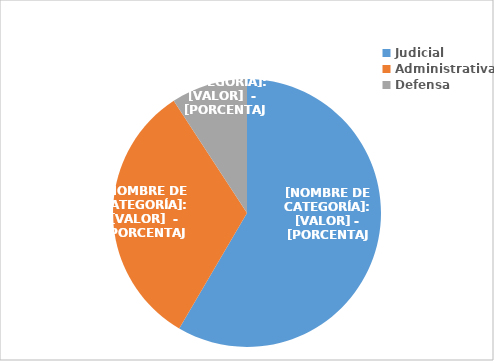
| Category | Series 0 |
|---|---|
| Judicial | 495 |
| Administrativa | 274 |
| Defensa | 78 |